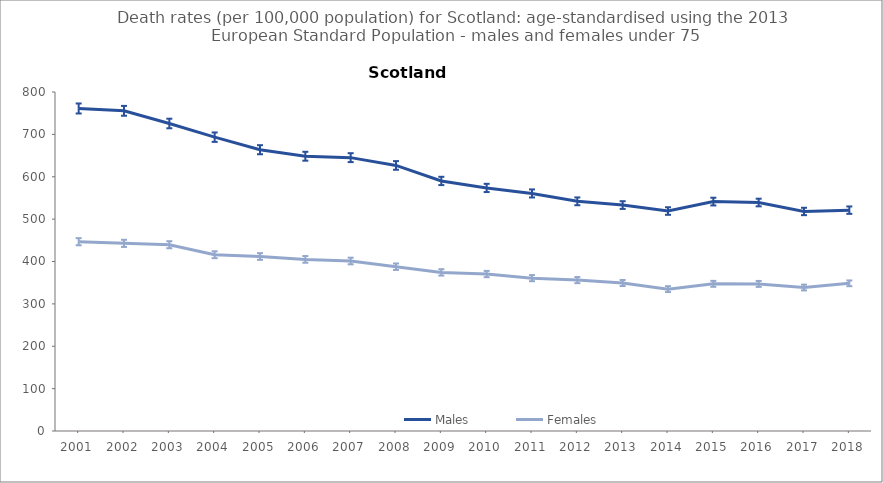
| Category | Males | Females |
|---|---|---|
| 2001.0 | 761.1 | 446.7 |
| 2002.0 | 755.6 | 442.8 |
| 2003.0 | 725.7 | 439.6 |
| 2004.0 | 693.4 | 416 |
| 2005.0 | 663.8 | 411.8 |
| 2006.0 | 648.4 | 405 |
| 2007.0 | 645.1 | 401.2 |
| 2008.0 | 626.7 | 387.7 |
| 2009.0 | 590.1 | 374.3 |
| 2010.0 | 573.6 | 370.4 |
| 2011.0 | 560.6 | 360.7 |
| 2012.0 | 542 | 356.1 |
| 2013.0 | 533.2 | 349.2 |
| 2014.0 | 519.1 | 334.8 |
| 2015.0 | 541.4 | 347.3 |
| 2016.0 | 539.2 | 347.1 |
| 2017.0 | 518.1 | 338.6 |
| 2018.0 | 521.2 | 348.5 |